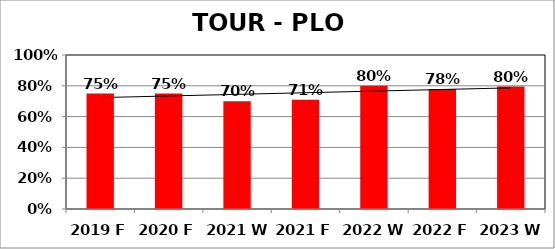
| Category | Series 0 |
|---|---|
| 2019 F | 0.75 |
| 2020 F | 0.75 |
| 2021 W | 0.7 |
| 2021 F | 0.71 |
| 2022 W | 0.8 |
| 2022 F | 0.78 |
| 2023 W | 0.795 |